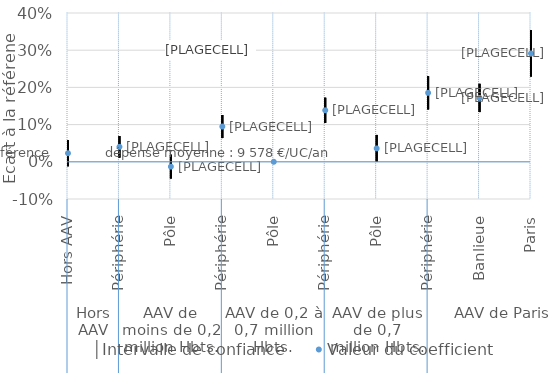
| Category | │Intervalle de confiance | Series 1 | Valeur du coefficient |
|---|---|---|---|
| 0 | 0.058 | -0.012 | 0.023 |
| 1 | 0.069 | 0.011 | 0.04 |
| 2 | 0.019 | -0.045 | -0.013 |
| 3 | 0.126 | 0.064 | 0.095 |
| 4 | 0 | 0 | 0 |
| 5 | 0.172 | 0.105 | 0.138 |
| 6 | 0.072 | 0 | 0.036 |
| 7 | 0.23 | 0.141 | 0.185 |
| 8 | 0.21 | 0.134 | 0.172 |
| 9 | 0.354 | 0.229 | 0.291 |